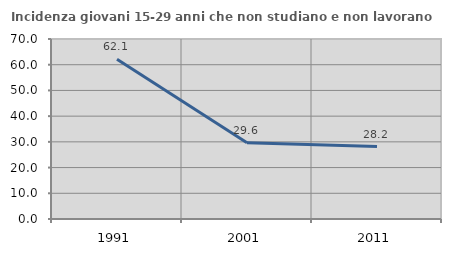
| Category | Incidenza giovani 15-29 anni che non studiano e non lavorano  |
|---|---|
| 1991.0 | 62.083 |
| 2001.0 | 29.63 |
| 2011.0 | 28.191 |